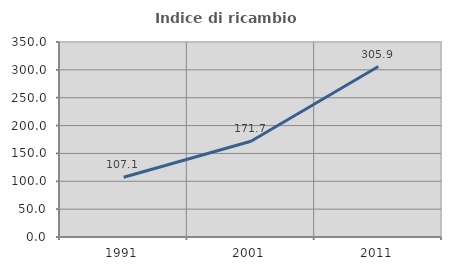
| Category | Indice di ricambio occupazionale  |
|---|---|
| 1991.0 | 107.143 |
| 2001.0 | 171.739 |
| 2011.0 | 305.882 |